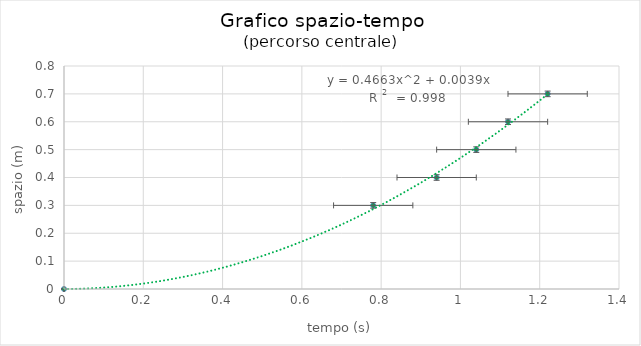
| Category | Series 0 |
|---|---|
| 0.0 | 0 |
| 0.7799999999999999 | 0.3 |
| 0.9399999999999998 | 0.4 |
| 1.04 | 0.5 |
| 1.1199999999999999 | 0.6 |
| 1.2200000000000002 | 0.7 |